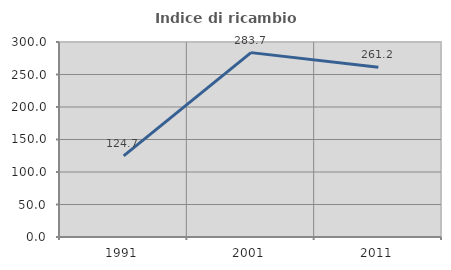
| Category | Indice di ricambio occupazionale  |
|---|---|
| 1991.0 | 124.699 |
| 2001.0 | 283.654 |
| 2011.0 | 261.224 |